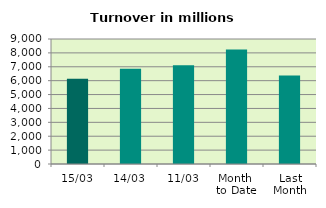
| Category | Series 0 |
|---|---|
| 15/03 | 6137.984 |
| 14/03 | 6858.83 |
| 11/03 | 7105.458 |
| Month 
to Date | 8241.146 |
| Last
Month | 6378.947 |